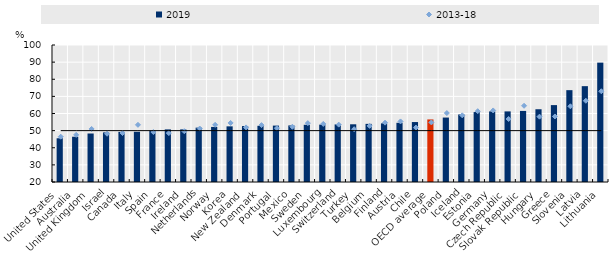
| Category | 2019 |
|---|---|
| United States | 45.54 |
| Australia | 46.437 |
| United Kingdom | 48.323 |
| Israel | 48.961 |
| Canada | 49.272 |
| Italy | 49.341 |
| Spain | 49.915 |
| France | 50.721 |
| Ireland | 50.729 |
| Netherlands | 51.743 |
| Norway | 52.161 |
| Korea | 52.499 |
| New Zealand | 52.659 |
| Denmark | 52.813 |
| Portugal | 52.931 |
| Mexico | 53.035 |
| Sweden | 53.41 |
| Luxembourg | 53.503 |
| Switzerland | 53.646 |
| Turkey | 53.701 |
| Belgium | 53.95 |
| Finland | 54.244 |
| Austria | 54.571 |
| Chile | 55.011 |
| OECD average | 56.533 |
| Poland | 57.635 |
| Iceland | 59.439 |
| Estonia | 60.842 |
| Germany | 61.216 |
| Czech Republic | 61.23 |
| Slovak Republic | 61.504 |
| Hungary | 62.484 |
| Greece | 64.902 |
| Slovenia | 73.632 |
| Latvia | 75.968 |
| Lithuania | 89.707 |